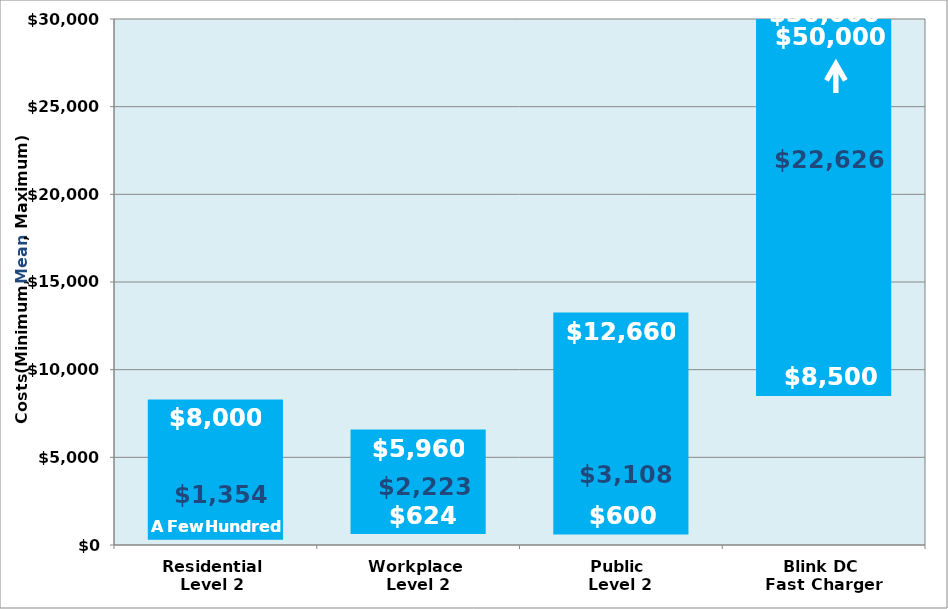
| Category | Series 0 | Series 1 |
|---|---|---|
| Residential 
Level 2  | 300 | 8000 |
| Workplace 
Level 2 | 624 | 5960 |
| Public 
Level 2 | 600 | 12660 |
| Blink DC 
Fast Charger | 8500 | 50000 |